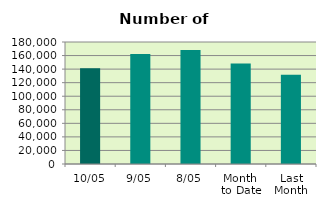
| Category | Series 0 |
|---|---|
| 10/05 | 141328 |
| 9/05 | 162318 |
| 8/05 | 168028 |
| Month 
to Date | 148367.143 |
| Last
Month | 131708.5 |